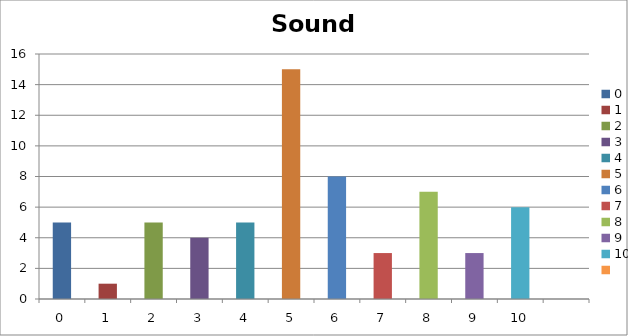
| Category | Sound Around |
|---|---|
| 0.0 | 5 |
| 1.0 | 1 |
| 2.0 | 5 |
| 3.0 | 4 |
| 4.0 | 5 |
| 5.0 | 15 |
| 6.0 | 8 |
| 7.0 | 3 |
| 8.0 | 7 |
| 9.0 | 3 |
| 10.0 | 6 |